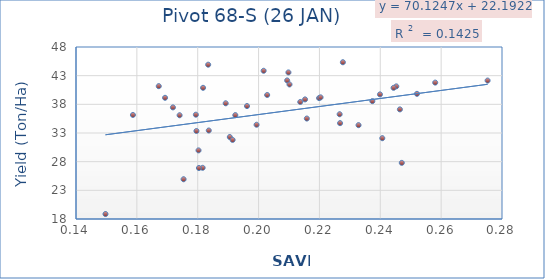
| Category | Series 0 |
|---|---|
| 0.25206 | 39.83 |
| 0.209815 | 43.563 |
| 0.237395 | 38.557 |
| 0.247064 | 27.79 |
| 0.245262 | 41.133 |
| 0.215272 | 38.86 |
| 0.24644 | 37.12 |
| 0.239899 | 39.733 |
| 0.219887 | 39.09 |
| 0.226782 | 34.72 |
| 0.227706 | 45.34 |
| 0.209397 | 42.167 |
| 0.189197 | 38.18 |
| 0.158708 | 36.147 |
| 0.180267 | 29.967 |
| 0.175357 | 24.933 |
| 0.149691 | 18.867 |
| 0.167195 | 41.167 |
| 0.232854 | 34.367 |
| 0.201668 | 43.853 |
| 0.183634 | 33.437 |
| 0.24437 | 40.877 |
| 0.226644 | 36.27 |
| 0.215856 | 35.523 |
| 0.258054 | 41.79 |
| 0.275268 | 42.147 |
| 0.202828 | 39.63 |
| 0.190546 | 32.297 |
| 0.210164 | 41.467 |
| 0.213705 | 38.41 |
| 0.192357 | 36.117 |
| 0.181619 | 26.927 |
| 0.196197 | 37.697 |
| 0.180402 | 26.893 |
| 0.174047 | 36.093 |
| 0.181758 | 40.88 |
| 0.171856 | 37.467 |
| 0.183441 | 44.913 |
| 0.179584 | 33.35 |
| 0.22038 | 39.217 |
| 0.19147 | 31.79 |
| 0.169268 | 39.14 |
| 0.199347 | 34.44 |
| 0.179393 | 36.193 |
| 0.24066 | 32.093 |